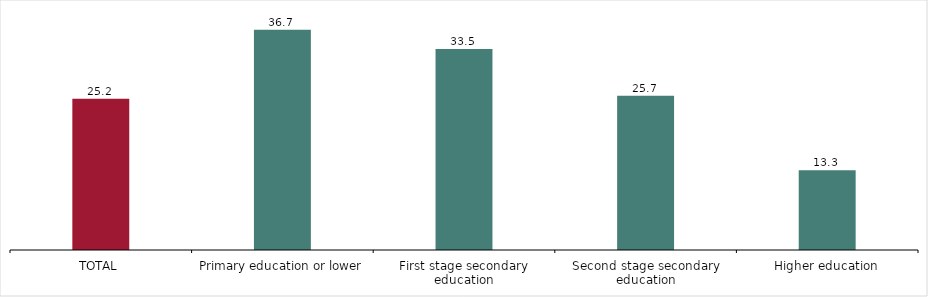
| Category | Nivel de formación alcanzado |
|---|---|
| TOTAL | 25.2 |
| Primary education or lower | 36.7 |
| First stage secondary education | 33.5 |
| Second stage secondary education | 25.7 |
| Higher education | 13.3 |